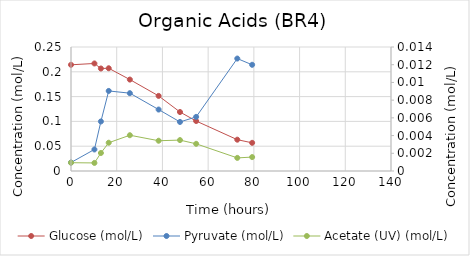
| Category | Glucose (mol/L) |
|---|---|
| 0.0 | 0.214 |
| 10.250000000058208 | 0.217 |
| 13.083333333372138 | 0.207 |
| 16.5 | 0.207 |
| 25.749999999941792 | 0.184 |
| 38.33333333325572 | 0.151 |
| 47.683333333348855 | 0.119 |
| 54.75 | 0.101 |
| 72.75 | 0.063 |
| 79.25000000005821 | 0.057 |